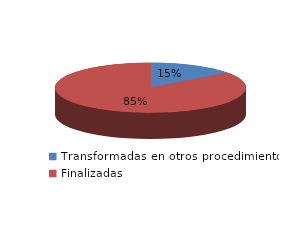
| Category | Series 0 |
|---|---|
| Transformadas en otros procedimientos | 2271 |
| Finalizadas | 13115 |